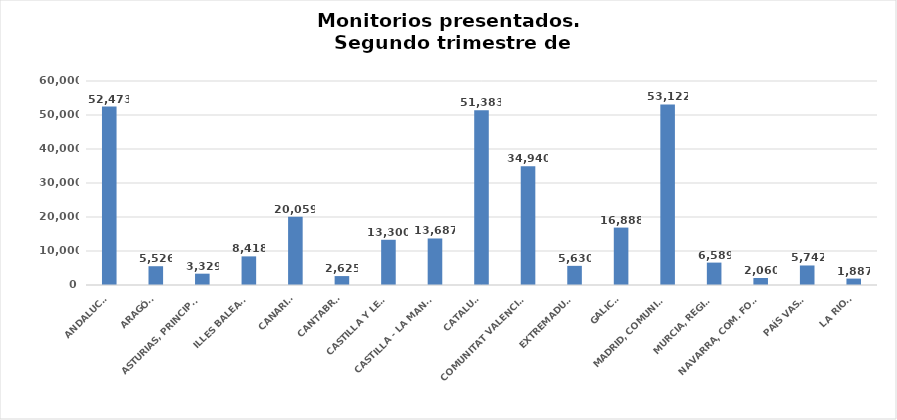
| Category | Series 0 |
|---|---|
| ANDALUCÍA | 52473 |
| ARAGÓN | 5526 |
| ASTURIAS, PRINCIPADO | 3329 |
| ILLES BALEARS | 8418 |
| CANARIAS | 20059 |
| CANTABRIA | 2625 |
| CASTILLA Y LEÓN | 13300 |
| CASTILLA - LA MANCHA | 13687 |
| CATALUÑA | 51383 |
| COMUNITAT VALENCIANA | 34940 |
| EXTREMADURA | 5630 |
| GALICIA | 16888 |
| MADRID, COMUNIDAD | 53122 |
| MURCIA, REGIÓN | 6589 |
| NAVARRA, COM. FORAL | 2060 |
| PAÍS VASCO | 5742 |
| LA RIOJA | 1887 |